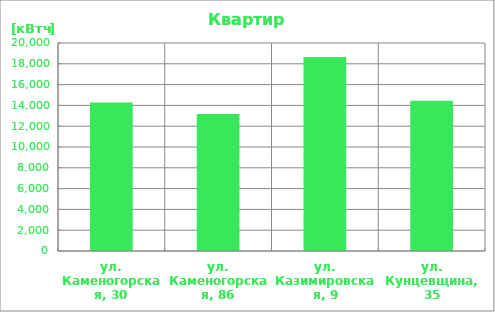
| Category | Series 0 |
|---|---|
| ул. Каменогорская, 30 | 14285.58 |
| ул. Каменогорская, 86 | 13165.442 |
| ул. Казимировская, 9 | 18644.238 |
| ул. Кунцевщина, 35 | 14450.727 |